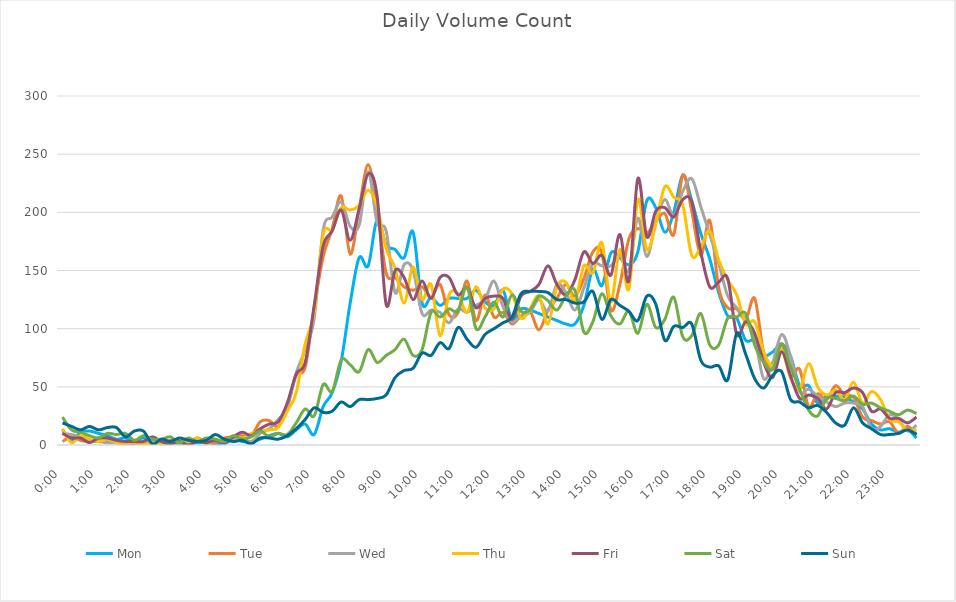
| Category | Mon | Tue | Wed | Thu | Fri | Sat | Sun |
|---|---|---|---|---|---|---|---|
| 0.0 | 13 | 3 | 10 | 14 | 10 | 24 | 19 |
| 0.010416666666666666 | 4 | 7 | 9 | 2 | 6 | 13 | 16 |
| 0.020833333333333332 | 11 | 4 | 7 | 8 | 6 | 11 | 13 |
| 0.03125 | 12 | 3 | 4 | 5 | 2 | 8 | 16 |
| 0.041666666666666664 | 10 | 4 | 3 | 3 | 6 | 6 | 13 |
| 0.05208333333333333 | 8 | 4 | 2 | 5 | 6 | 10 | 15 |
| 0.06249999999999999 | 5 | 2 | 2 | 2 | 4 | 9 | 15 |
| 0.07291666666666666 | 6 | 2 | 0 | 2 | 3 | 10 | 7 |
| 0.08333333333333333 | 3 | 1 | 4 | 2 | 3 | 4 | 12 |
| 0.09375 | 6 | 1 | 2 | 1 | 3 | 8 | 12 |
| 0.10416666666666667 | 1 | 1 | 3 | 1 | 7 | 5 | 1 |
| 0.11458333333333334 | 1 | 1 | 2 | 1 | 3 | 5 | 5 |
| 0.125 | 1 | 4 | 1 | 0 | 1 | 7 | 3 |
| 0.13541666666666666 | 1 | 4 | 1 | 4 | 3 | 2 | 6 |
| 0.14583333333333331 | 2 | 0 | 1 | 3 | 0 | 6 | 4 |
| 0.15624999999999997 | 2 | 6 | 5 | 6 | 3 | 3 | 3 |
| 0.16666666666666663 | 2 | 2 | 1 | 1 | 2 | 6 | 4 |
| 0.1770833333333333 | 1 | 2 | 4 | 5 | 4 | 5 | 9 |
| 0.18749999999999994 | 1 | 6 | 4 | 2 | 2 | 3 | 5 |
| 0.1979166666666666 | 5 | 7 | 5 | 8 | 7 | 8 | 3 |
| 0.20833333333333326 | 3 | 8 | 5 | 6 | 11 | 5 | 4 |
| 0.21874999999999992 | 3 | 8 | 3 | 10 | 8 | 7 | 1 |
| 0.22916666666666657 | 5 | 20 | 10 | 12 | 14 | 12 | 6 |
| 0.23958333333333323 | 8 | 21 | 14 | 13 | 18 | 7 | 6 |
| 0.2499999999999999 | 10 | 16 | 22 | 15 | 20 | 10 | 5 |
| 0.2604166666666666 | 7 | 34 | 32 | 29 | 36 | 9 | 8 |
| 0.27083333333333326 | 13 | 60 | 62 | 45 | 61 | 19 | 14 |
| 0.28124999999999994 | 18 | 67 | 82 | 87 | 71 | 31 | 22 |
| 0.29166666666666663 | 9 | 118 | 109 | 114 | 120 | 25 | 32 |
| 0.3020833333333333 | 33 | 162 | 185 | 181 | 171 | 52 | 28 |
| 0.3125 | 45 | 186 | 196 | 185 | 184 | 46 | 29 |
| 0.3229166666666667 | 72 | 214 | 209 | 204 | 202 | 73 | 37 |
| 0.33333333333333337 | 122 | 164 | 188 | 202 | 176 | 69 | 33 |
| 0.34375000000000006 | 161 | 203 | 189 | 206 | 203 | 63 | 39 |
| 0.35416666666666674 | 154 | 241 | 235 | 219 | 233 | 82 | 39 |
| 0.3645833333333334 | 194 | 202 | 191 | 205 | 214 | 71 | 40 |
| 0.3750000000000001 | 172 | 148 | 184 | 169 | 121 | 77 | 43 |
| 0.3854166666666668 | 168 | 144 | 131 | 152 | 150 | 82 | 58 |
| 0.3958333333333335 | 161 | 136 | 155 | 122 | 144 | 91 | 64 |
| 0.40625000000000017 | 183 | 133 | 150 | 153 | 125 | 77 | 66 |
| 0.41666666666666685 | 122 | 136 | 113 | 125 | 141 | 82 | 79 |
| 0.4270833333333333 | 127 | 127 | 116 | 138 | 126 | 114 | 77 |
| 0.4375000000000002 | 120 | 138 | 114 | 94 | 144 | 110 | 88 |
| 0.4479166666666669 | 126 | 112 | 105 | 129 | 144 | 117 | 83 |
| 0.4583333333333333 | 126 | 114 | 117 | 130 | 129 | 115 | 101 |
| 0.4687500000000003 | 126 | 141 | 114 | 114 | 135 | 136 | 91 |
| 0.47916666666666696 | 133 | 107 | 120 | 136 | 118 | 100 | 84 |
| 0.4895833333333333 | 123 | 129 | 125 | 118 | 126 | 110 | 95 |
| 0.5000000000000003 | 120 | 110 | 141 | 117 | 128 | 123 | 100 |
| 0.510416666666667 | 133 | 114 | 119 | 134 | 126 | 110 | 105 |
| 0.5208333333333334 | 107 | 104 | 106 | 130 | 108 | 129 | 110 |
| 0.5312500000000002 | 117 | 111 | 111 | 109 | 128 | 115 | 130 |
| 0.5416666666666669 | 116 | 115 | 114 | 117 | 132 | 116 | 132 |
| 0.5520833333333335 | 113 | 99 | 125 | 128 | 138 | 128 | 132 |
| 0.5625000000000001 | 110 | 116 | 115 | 104 | 154 | 124 | 131 |
| 0.5729166666666667 | 107 | 126 | 138 | 136 | 138 | 116 | 125 |
| 0.5833333333333334 | 104 | 138 | 131 | 140 | 129 | 128 | 125 |
| 0.59375 | 104 | 128 | 116 | 124 | 142 | 133 | 122 |
| 0.6041666666666666 | 120 | 143 | 135 | 154 | 166 | 97 | 123 |
| 0.6145833333333333 | 151 | 166 | 156 | 148 | 156 | 106 | 132 |
| 0.6249999999999999 | 137 | 165 | 154 | 174 | 163 | 130 | 108 |
| 0.6354166666666665 | 165 | 116 | 154 | 123 | 146 | 111 | 125 |
| 0.6458333333333331 | 161 | 138 | 163 | 168 | 181 | 104 | 120 |
| 0.6562499999999998 | 155 | 177 | 150 | 134 | 141 | 115 | 115 |
| 0.6666666666666666 | 166 | 186 | 195 | 211 | 229 | 96 | 107 |
| 0.677083333333333 | 210 | 182 | 162 | 168 | 179 | 121 | 128 |
| 0.6874999999999997 | 204 | 192 | 192 | 190 | 201 | 101 | 121 |
| 0.6979166666666666 | 183 | 199 | 211 | 222 | 204 | 108 | 90 |
| 0.7083333333333329 | 200 | 181 | 197 | 213 | 196 | 127 | 102 |
| 0.7187499999999996 | 232 | 232 | 218 | 206 | 211 | 93 | 101 |
| 0.7291666666666666 | 210 | 201 | 229 | 163 | 209 | 94 | 104 |
| 0.7395833333333328 | 182 | 163 | 205 | 170 | 166 | 113 | 73 |
| 0.75 | 160 | 193 | 181 | 184 | 136 | 86 | 67 |
| 0.7604166666666666 | 131 | 135 | 156 | 159 | 140 | 86 | 68 |
| 0.7708333333333327 | 111 | 118 | 128 | 142 | 143 | 109 | 56 |
| 0.78125 | 109 | 117 | 118 | 129 | 95 | 110 | 96 |
| 0.7916666666666666 | 90 | 108 | 108 | 104 | 106 | 113 | 78 |
| 0.8020833333333326 | 90 | 126 | 92 | 106 | 96 | 86 | 57 |
| 0.8125 | 77 | 79 | 57 | 80 | 71 | 71 | 49 |
| 0.8229166666666666 | 80 | 68 | 71 | 68 | 58 | 65 | 60 |
| 0.8333333333333334 | 87 | 86 | 95 | 82 | 80 | 87 | 63 |
| 0.84375 | 76 | 60 | 76 | 57 | 59 | 67 | 39 |
| 0.8541666666666666 | 51 | 65 | 46 | 48 | 40 | 48 | 37 |
| 0.8645833333333334 | 51 | 33 | 48 | 70 | 43 | 30 | 32 |
| 0.875 | 36 | 44 | 42 | 50 | 40 | 25 | 34 |
| 0.8854166666666666 | 42 | 39 | 37 | 43 | 31 | 40 | 28 |
| 0.8958333333333334 | 42 | 51 | 33 | 47 | 45 | 40 | 19 |
| 0.90625 | 41 | 43 | 36 | 39 | 45 | 38 | 17 |
| 0.9166666666666666 | 37 | 41 | 36 | 54 | 49 | 42 | 32 |
| 0.9270833333333334 | 31 | 24 | 33 | 36 | 45 | 35 | 19 |
| 0.9375 | 18 | 21 | 14 | 46 | 29 | 36 | 14 |
| 0.9479166666666666 | 13 | 18 | 16 | 39 | 31 | 32 | 9 |
| 0.9583333333333334 | 14 | 20 | 26 | 22 | 23 | 29 | 9 |
| 0.96875 | 11 | 10 | 22 | 20 | 23 | 26 | 10 |
| 0.9791666666666666 | 13 | 16 | 12 | 13 | 19 | 30 | 13 |
| 0.9895833333333334 | 6 | 9 | 17 | 13 | 24 | 27 | 9 |